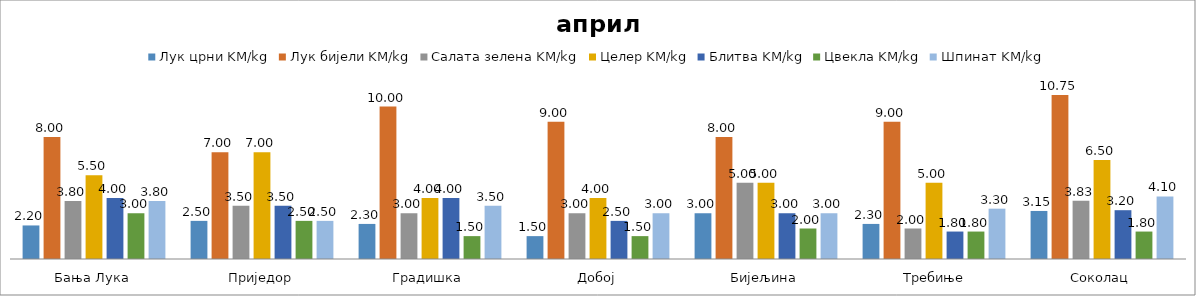
| Category | Лук црни KM/kg | Лук бијели KM/kg | Салата зелена KM/kg | Целер KM/kg | Блитва KM/kg | Цвекла KM/kg | Шпинат KM/kg |
|---|---|---|---|---|---|---|---|
| Бања Лука | 2.2 | 8 | 3.8 | 5.5 | 4 | 3 | 3.8 |
| Приједор | 2.5 | 7 | 3.5 | 7 | 3.5 | 2.5 | 2.5 |
| Градишка | 2.3 | 10 | 3 | 4 | 4 | 1.5 | 3.5 |
| Добој | 1.5 | 9 | 3 | 4 | 2.5 | 1.5 | 3 |
| Бијељина | 3 | 8 | 5 | 5 | 3 | 2 | 3 |
|  Требиње | 2.3 | 9 | 2 | 5 | 1.8 | 1.8 | 3.3 |
| Соколац | 3.15 | 10.75 | 3.825 | 6.5 | 3.2 | 1.8 | 4.1 |